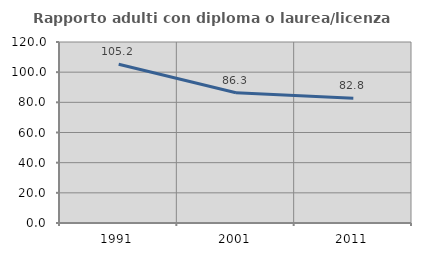
| Category | Rapporto adulti con diploma o laurea/licenza media  |
|---|---|
| 1991.0 | 105.205 |
| 2001.0 | 86.316 |
| 2011.0 | 82.77 |